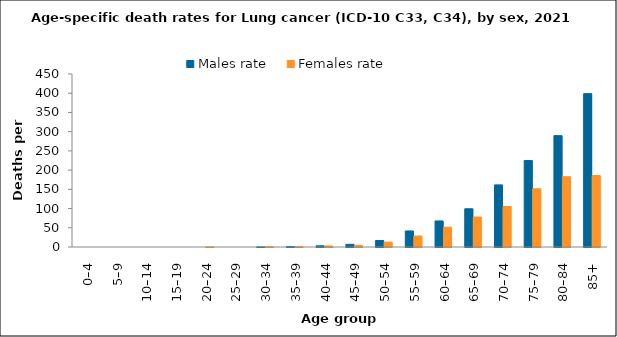
| Category | Males rate | Females rate |
|---|---|---|
| 0–4 | 0 | 0 |
| 5–9 | 0 | 0 |
| 10–14 | 0 | 0 |
| 15–19 | 0 | 0 |
| 20–24 | 0 | 0.127 |
| 25–29 | 0 | 0 |
| 30–34 | 0.213 | 0.417 |
| 35–39 | 1.077 | 0.639 |
| 40–44 | 3.187 | 2.623 |
| 45–49 | 6.974 | 4.203 |
| 50–54 | 16.873 | 12.723 |
| 55–59 | 41.703 | 28.554 |
| 60–64 | 67.774 | 51.47 |
| 65–69 | 99.427 | 78.025 |
| 70–74 | 161.531 | 105.391 |
| 75–79 | 224.834 | 151.424 |
| 80–84 | 289.644 | 182.775 |
| 85+ | 398.914 | 185.9 |